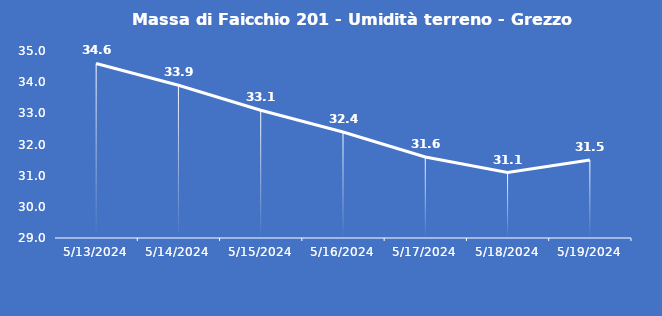
| Category | Massa di Faicchio 201 - Umidità terreno - Grezzo (%VWC) |
|---|---|
| 5/13/24 | 34.6 |
| 5/14/24 | 33.9 |
| 5/15/24 | 33.1 |
| 5/16/24 | 32.4 |
| 5/17/24 | 31.6 |
| 5/18/24 | 31.1 |
| 5/19/24 | 31.5 |